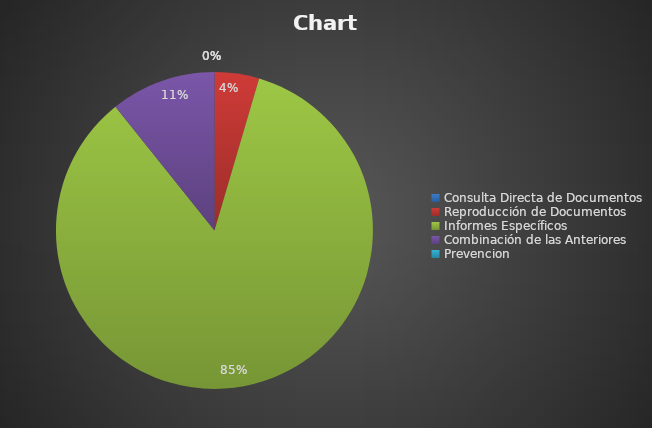
| Category | Series 0 |
|---|---|
| Consulta Directa de Documentos | 0 |
| Reproducción de Documentos | 11 |
| Informes Específicos | 205 |
| Combinación de las Anteriores | 26 |
| Prevencion | 0 |